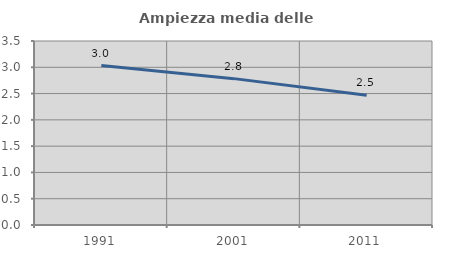
| Category | Ampiezza media delle famiglie |
|---|---|
| 1991.0 | 3.033 |
| 2001.0 | 2.784 |
| 2011.0 | 2.468 |